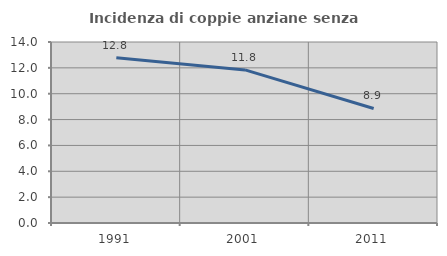
| Category | Incidenza di coppie anziane senza figli  |
|---|---|
| 1991.0 | 12.782 |
| 2001.0 | 11.842 |
| 2011.0 | 8.861 |